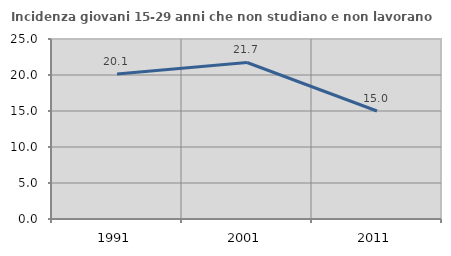
| Category | Incidenza giovani 15-29 anni che non studiano e non lavorano  |
|---|---|
| 1991.0 | 20.137 |
| 2001.0 | 21.739 |
| 2011.0 | 15 |